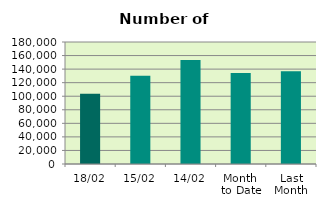
| Category | Series 0 |
|---|---|
| 18/02 | 103692 |
| 15/02 | 130242 |
| 14/02 | 153522 |
| Month 
to Date | 134357.5 |
| Last
Month | 136846.364 |